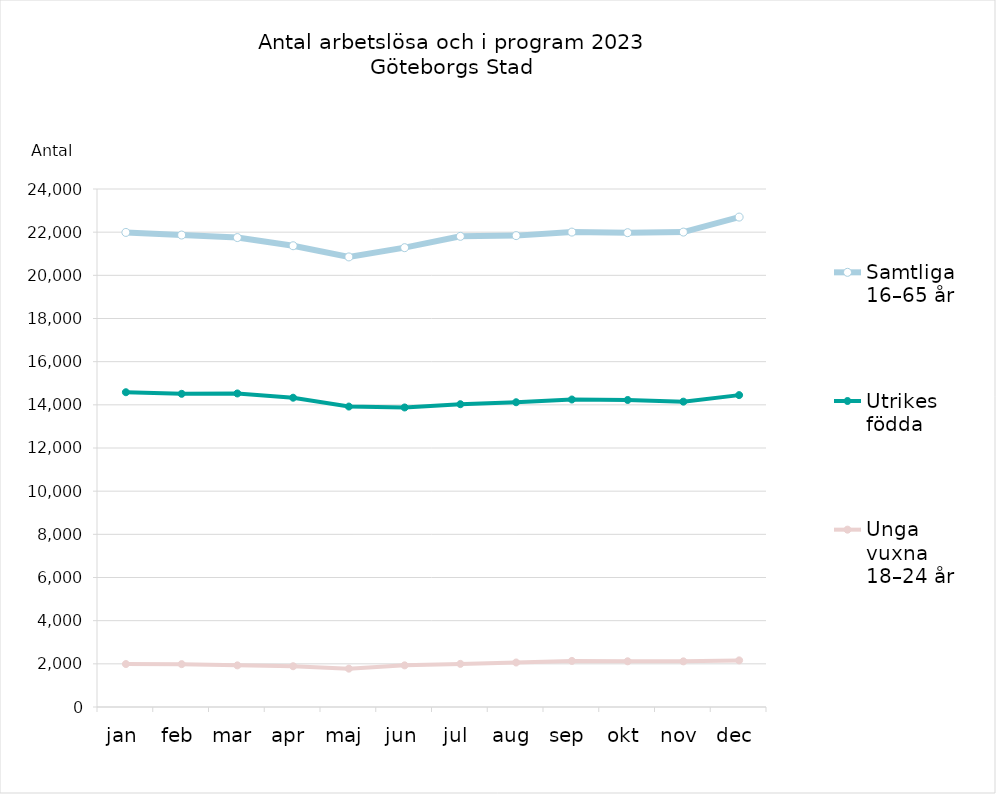
| Category | Samtliga 16–65 år | Utrikes födda | Unga vuxna 18–24 år |
|---|---|---|---|
| jan | 21988 | 14584 | 1991 |
| feb | 21867 | 14510 | 1986 |
| mar | 21750 | 14527 | 1929 |
| apr | 21371 | 14330 | 1889 |
| maj | 20853 | 13920 | 1777 |
| jun | 21282 | 13878 | 1930 |
| jul | 21807 | 14029 | 1998 |
| aug | 21840 | 14120 | 2062 |
| sep | 22003 | 14247 | 2135 |
| okt | 21976 | 14225 | 2118 |
| nov | 22004 | 14147 | 2115 |
| dec | 22699 | 14450 | 2160 |